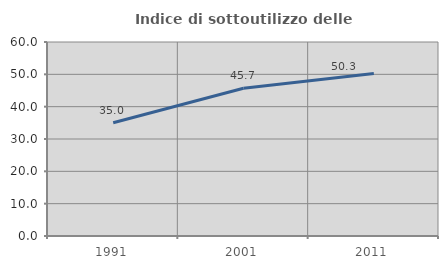
| Category | Indice di sottoutilizzo delle abitazioni  |
|---|---|
| 1991.0 | 35.028 |
| 2001.0 | 45.685 |
| 2011.0 | 50.27 |